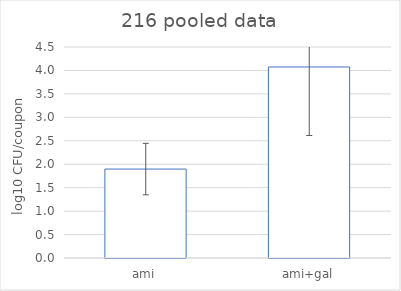
| Category | Series 0 |
|---|---|
| ami | 1.897 |
| ami+gal | 4.074 |